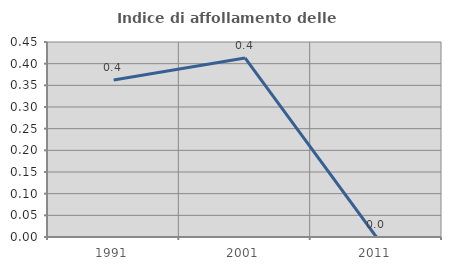
| Category | Indice di affollamento delle abitazioni  |
|---|---|
| 1991.0 | 0.362 |
| 2001.0 | 0.413 |
| 2011.0 | 0 |